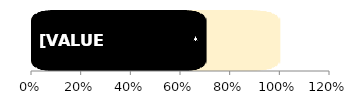
| Category | Total | Men |
|---|---|---|
| 0 | 1 | 0.703 |